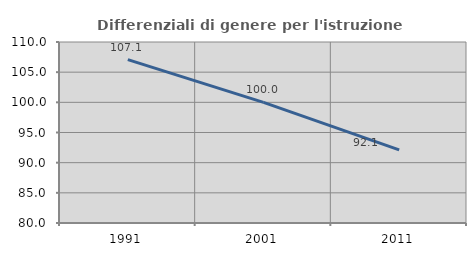
| Category | Differenziali di genere per l'istruzione superiore |
|---|---|
| 1991.0 | 107.086 |
| 2001.0 | 99.995 |
| 2011.0 | 92.121 |